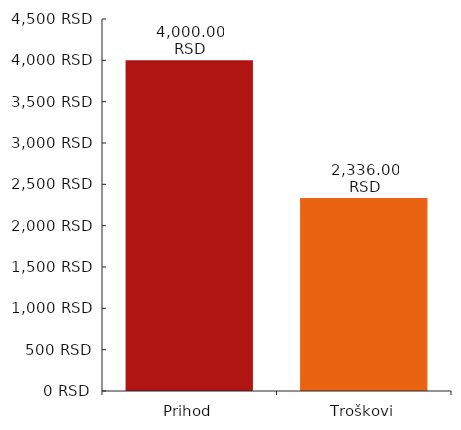
| Category | PodaciGrafikona |
|---|---|
| 0 | 4000 |
| 1 | 2336 |